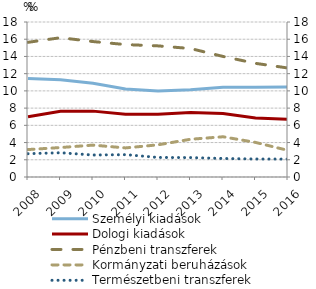
| Category | Személyi kiadások  | Dologi kiadások  | Pénzbeni transzferek | Kormányzati beruházások |
|---|---|---|---|---|
| 2008.0 | 11.44 | 6.991 | 15.641 | 3.186 |
| 2009.0 | 11.301 | 7.629 | 16.176 | 3.422 |
| 2010.0 | 10.896 | 7.65 | 15.728 | 3.703 |
| 2011.0 | 10.225 | 7.294 | 15.378 | 3.377 |
| 2012.0 | 9.981 | 7.286 | 15.226 | 3.736 |
| 2013.0 | 10.146 | 7.496 | 14.921 | 4.382 |
| 2014.0 | 10.412 | 7.369 | 14.001 | 4.672 |
| 2015.0 | 10.433 | 6.851 | 13.199 | 4.016 |
| 2016.0 | 10.462 | 6.713 | 12.655 | 3.091 |